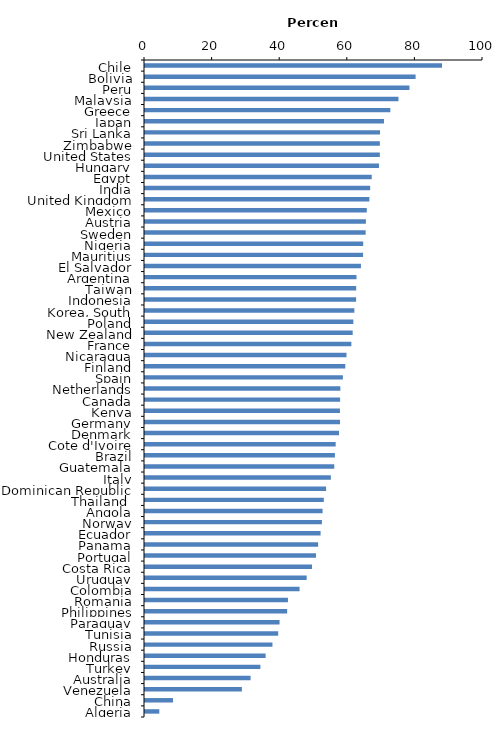
| Category | Series 0 |
|---|---|
| Chile | 87.871 |
| Bolivia | 80.058 |
| Peru | 78.243 |
| Malaysia | 74.995 |
| Greece | 72.584 |
| Japan | 70.699 |
| Sri Lanka | 69.537 |
| Zimbabwe | 69.485 |
| United States | 69.478 |
| Hungary | 69.223 |
| Egypt | 67.079 |
| India | 66.614 |
| United Kingdom | 66.38 |
| Mexico | 65.615 |
| Austria | 65.355 |
| Sweden | 65.281 |
| Nigeria | 64.552 |
| Mauritius | 64.518 |
| El Salvador | 63.889 |
| Argentina | 62.577 |
| Taiwan | 62.484 |
| Indonesia | 62.462 |
| Korea, South | 61.942 |
| Poland | 61.637 |
| New Zealand | 61.444 |
| France | 61.058 |
| Nicaragua | 59.615 |
| Finland | 59.255 |
| Spain | 58.541 |
| Netherlands | 57.805 |
| Canada | 57.725 |
| Kenya | 57.679 |
| Germany | 57.701 |
| Denmark | 57.404 |
| Cote d'Ivoire | 56.41 |
| Brazil | 56.186 |
| Guatemala | 56 |
| Italy | 54.985 |
| Dominican Republic | 53.586 |
| Thailand  | 52.903 |
| Angola | 52.537 |
| Norway | 52.344 |
| Ecuador | 51.95 |
| Panama | 51.22 |
| Portugal | 50.603 |
| Costa Rica | 49.402 |
| Uruguay | 47.832 |
| Colombia | 45.733 |
| Romania | 42.289 |
| Philippines | 42.061 |
| Paraguay | 39.808 |
| Tunisia | 39.408 |
| Russia | 37.707 |
| Honduras | 35.692 |
| Turkey | 34.141 |
| Australia | 31.237 |
| Venezuela | 28.667 |
| China | 8.285 |
| Algeria | 4.236 |